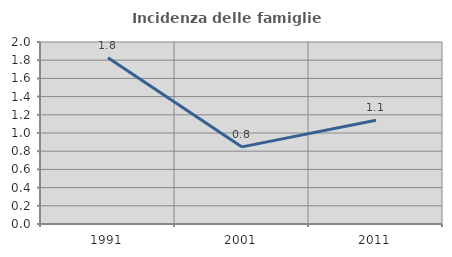
| Category | Incidenza delle famiglie numerose |
|---|---|
| 1991.0 | 1.826 |
| 2001.0 | 0.847 |
| 2011.0 | 1.141 |